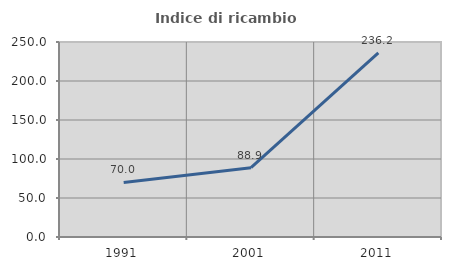
| Category | Indice di ricambio occupazionale  |
|---|---|
| 1991.0 | 70 |
| 2001.0 | 88.889 |
| 2011.0 | 236.17 |